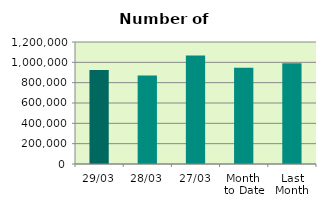
| Category | Series 0 |
|---|---|
| 29/03 | 925462 |
| 28/03 | 869786 |
| 27/03 | 1066904 |
| Month 
to Date | 947588.19 |
| Last
Month | 989849.1 |